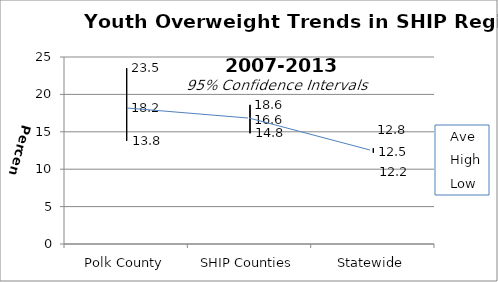
| Category | Ave | High | Low |
|---|---|---|---|
| Polk County | 18.2 | 23.5 | 13.8 |
| SHIP Counties | 16.6 | 18.6 | 14.8 |
| Statewide | 12.5 | 12.8 | 12.2 |